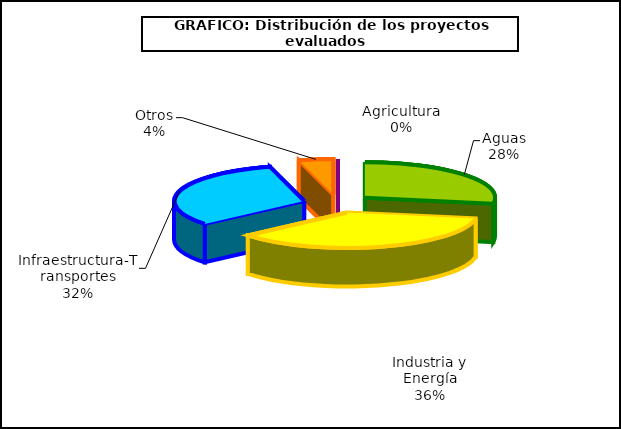
| Category | Series 0 |
|---|---|
| 0 | 0 |
| 1 | 13 |
| 2 | 17 |
| 3 | 15 |
| 4 | 2 |